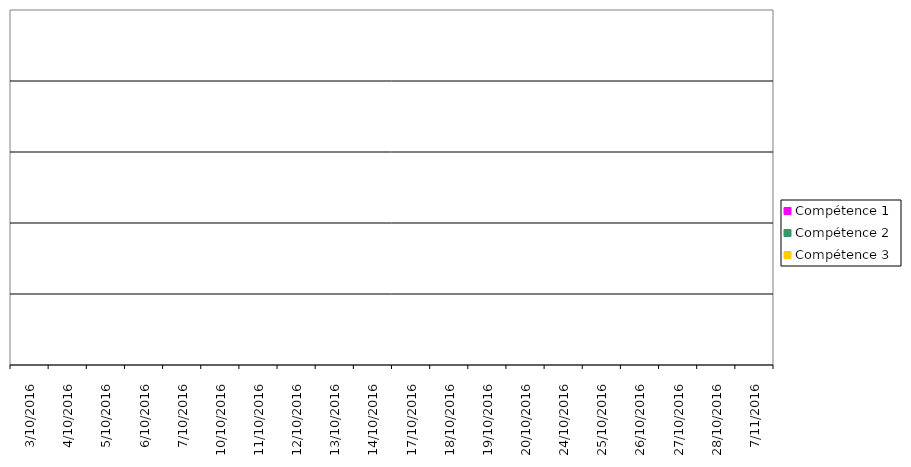
| Category | Compétence 1 | Compétence 2 | Compétence 3 |
|---|---|---|---|
| 3/10/2016 | 0 | 0 | 0 |
| 4/10/2016 | 0 | 0 | 0 |
| 5/10/2016 | 0 | 0 | 0 |
| 6/10/2016 | 0 | 0 | 0 |
| 7/10/2016 | 0 | 0 | 0 |
| 10/10/2016 | 0 | 0 | 0 |
| 11/10/2016 | 0 | 0 | 0 |
| 12/10/2016 | 0 | 0 | 0 |
| 13/10/2016 | 0 | 0 | 0 |
| 14/10/2016 | 0 | 0 | 0 |
| 17/10/2016 | 0 | 0 | 0 |
| 18/10/2016 | 0 | 0 | 0 |
| 19/10/2016 | 0 | 0 | 0 |
| 20/10/2016 | 0 | 0 | 0 |
| 24/10/2016 | 0 | 0 | 0 |
| 25/10/2016 | 0 | 0 | 0 |
| 26/10/2016 | 0 | 0 | 0 |
| 27/10/2016 | 0 | 0 | 0 |
| 28/10/2016 | 0 | 0 | 0 |
| 7/11/2016 | 0 | 0 | 0 |